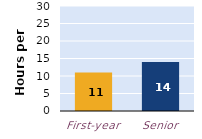
| Category | hours per week |
|---|---|
| First-year | 11 |
| Senior | 14 |